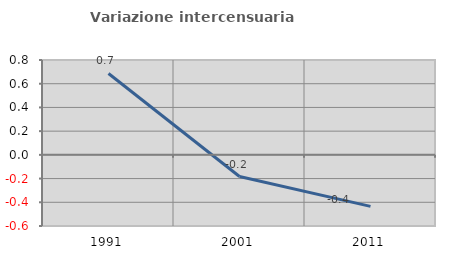
| Category | Variazione intercensuaria annua |
|---|---|
| 1991.0 | 0.686 |
| 2001.0 | -0.183 |
| 2011.0 | -0.435 |